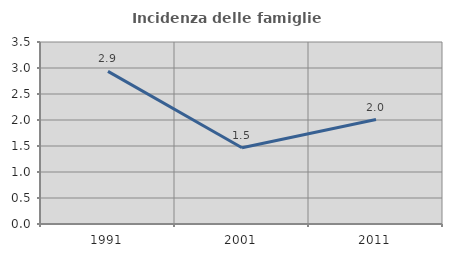
| Category | Incidenza delle famiglie numerose |
|---|---|
| 1991.0 | 2.936 |
| 2001.0 | 1.466 |
| 2011.0 | 2.009 |